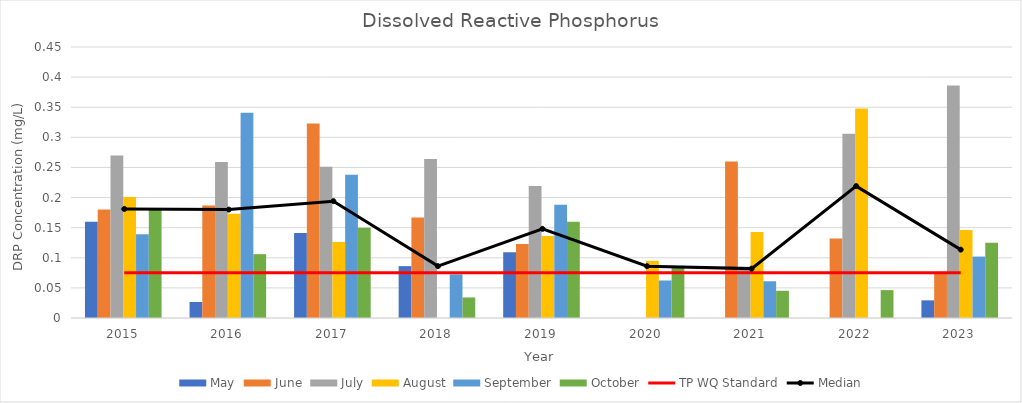
| Category | May | June | July | August | September | October |
|---|---|---|---|---|---|---|
| 2015.0 | 0.16 | 0.18 | 0.27 | 0.201 | 0.139 | 0.182 |
| 2016.0 | 0.027 | 0.187 | 0.259 | 0.173 | 0.341 | 0.106 |
| 2017.0 | 0.141 | 0.323 | 0.251 | 0.126 | 0.238 | 0.15 |
| 2018.0 | 0.086 | 0.167 | 0.264 | 0 | 0.072 | 0.034 |
| 2019.0 | 0.109 | 0.123 | 0.219 | 0.136 | 0.188 | 0.16 |
| 2020.0 | 0 | 0 | 0 | 0.095 | 0.062 | 0.086 |
| 2021.0 | 0 | 0.26 | 0.082 | 0.143 | 0.061 | 0.045 |
| 2022.0 | 0 | 0.132 | 0.306 | 0.348 | 0 | 0.046 |
| 2023.0 | 0.029 | 0.077 | 0.386 | 0.146 | 0.102 | 0.125 |